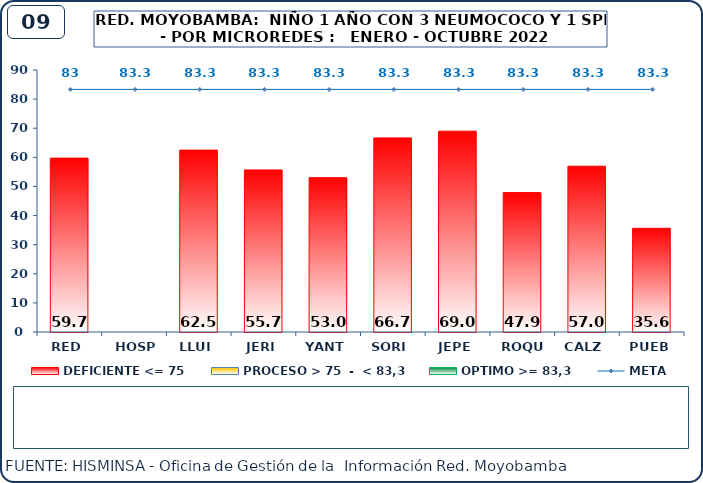
| Category | DEFICIENTE <= 75 | PROCESO > 75  -  < 83,3 | OPTIMO >= 83,3 |
|---|---|---|---|
| RED | 59.73 | 0 | 0 |
| HOSP | 0 | 0 | 0 |
| LLUI | 62.48 | 0 | 0 |
| JERI | 55.67 | 0 | 0 |
| YANT | 53.04 | 0 | 0 |
| SORI | 66.67 | 0 | 0 |
| JEPE | 68.98 | 0 | 0 |
| ROQU | 47.9 | 0 | 0 |
| CALZ | 56.95 | 0 | 0 |
| PUEB | 35.63 | 0 | 0 |